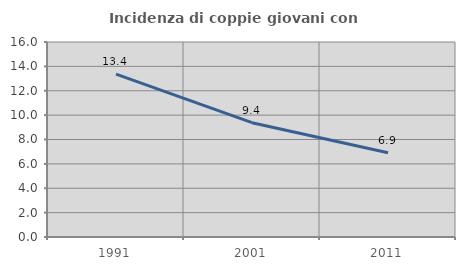
| Category | Incidenza di coppie giovani con figli |
|---|---|
| 1991.0 | 13.371 |
| 2001.0 | 9.379 |
| 2011.0 | 6.906 |